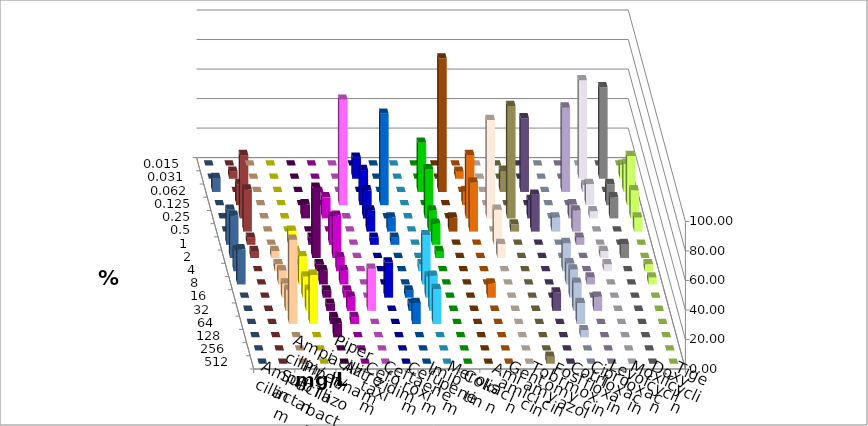
| Category | Ampicillin | Ampicillin/ Sulbactam | Piperacillin | Piperacillin/ Tazobactam | Aztreonam | Cefotaxim | Ceftazidim | Cefuroxim | Imipenem | Meropenem | Colistin | Amikacin | Gentamicin | Tobramycin | Fosfomycin | Cotrimoxazol | Ciprofloxacin | Levofloxacin | Moxifloxacin | Doxycyclin | Tigecyclin |
|---|---|---|---|---|---|---|---|---|---|---|---|---|---|---|---|---|---|---|---|---|---|
| 0.015 | 0 | 0 | 0 | 0 | 0 | 0 | 0 | 0 | 0 | 0 | 0 | 0 | 0 | 0 | 0 | 0 | 0 | 0 | 0 | 0 | 0 |
| 0.031 | 0 | 0 | 0 | 0 | 0 | 14.286 | 0 | 0 | 0 | 0 | 4.762 | 0 | 0 | 0 | 0 | 0 | 66.667 | 61.905 | 9.524 | 0 | 4.762 |
| 0.062 | 0 | 0 | 0 | 0 | 0 | 0 | 0 | 0 | 33.333 | 90.476 | 0 | 0 | 14.286 | 50 | 0 | 57.143 | 4.762 | 0 | 19.048 | 9.524 | 0 |
| 0.125 | 0 | 0 | 0 | 0 | 71.429 | 23.81 | 61.905 | 0 | 0 | 0 | 9.524 | 0 | 0 | 0 | 0 | 0 | 14.286 | 14.286 | 33.333 | 0 | 14.286 |
| 0.25 | 0 | 0 | 9.524 | 14.286 | 0 | 19.048 | 0 | 0 | 33.333 | 0 | 42.857 | 66.667 | 76.19 | 12.5 | 0 | 9.524 | 4.762 | 14.286 | 19.048 | 0 | 42.857 |
| 0.5 | 0 | 0 | 0 | 0 | 0 | 14.286 | 9.524 | 0 | 14.286 | 9.524 | 33.333 | 0 | 4.762 | 25 | 9.524 | 14.286 | 0 | 0 | 9.524 | 0 | 28.571 |
| 1.0 | 0 | 9.524 | 4.762 | 19.048 | 0 | 4.762 | 4.762 | 0 | 14.286 | 0 | 0 | 23.81 | 0 | 0 | 0 | 4.762 | 0 | 0 | 0 | 23.81 | 4.762 |
| 2.0 | 4.762 | 4.762 | 47.619 | 28.571 | 0 | 0 | 0 | 0 | 4.762 | 0 | 0 | 9.524 | 0 | 0 | 0 | 0 | 4.762 | 9.524 | 0 | 28.571 | 4.762 |
| 4.0 | 4.762 | 4.762 | 4.762 | 9.524 | 0 | 0 | 0 | 4.762 | 0 | 0 | 0 | 0 | 0 | 0 | 19.048 | 0 | 4.762 | 0 | 4.762 | 14.286 | 0 |
| 8.0 | 9.524 | 19.048 | 9.524 | 9.524 | 0 | 0 | 0 | 33.333 | 0 | 0 | 0 | 0 | 0 | 0 | 14.286 | 4.762 | 0 | 0 | 4.762 | 23.81 | 0 |
| 16.0 | 9.524 | 14.286 | 4.762 | 4.762 | 0 | 23.81 | 4.762 | 14.286 | 0 | 0 | 9.524 | 0 | 0 | 0 | 19.048 | 0 | 0 | 0 | 0 | 0 | 0 |
| 32.0 | 14.286 | 14.286 | 4.762 | 9.524 | 28.571 | 0 | 4.762 | 23.81 | 0 | 0 | 0 | 0 | 0 | 12.5 | 19.048 | 9.524 | 0 | 0 | 0 | 0 | 0 |
| 64.0 | 57.143 | 33.333 | 4.762 | 4.762 | 0 | 0 | 14.286 | 23.81 | 0 | 0 | 0 | 0 | 0 | 0 | 14.286 | 0 | 0 | 0 | 0 | 0 | 0 |
| 128.0 | 0 | 0 | 9.524 | 0 | 0 | 0 | 0 | 0 | 0 | 0 | 0 | 0 | 0 | 0 | 4.762 | 0 | 0 | 0 | 0 | 0 | 0 |
| 256.0 | 0 | 0 | 0 | 0 | 0 | 0 | 0 | 0 | 0 | 0 | 0 | 0 | 0 | 0 | 0 | 0 | 0 | 0 | 0 | 0 | 0 |
| 512.0 | 0 | 0 | 0 | 0 | 0 | 0 | 0 | 0 | 0 | 0 | 0 | 0 | 4.762 | 0 | 0 | 0 | 0 | 0 | 0 | 0 | 0 |